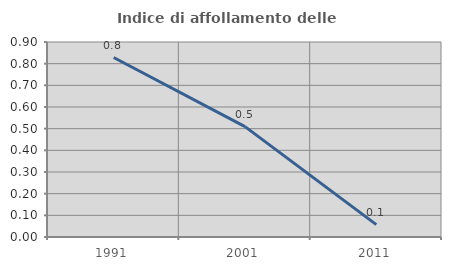
| Category | Indice di affollamento delle abitazioni  |
|---|---|
| 1991.0 | 0.828 |
| 2001.0 | 0.509 |
| 2011.0 | 0.057 |